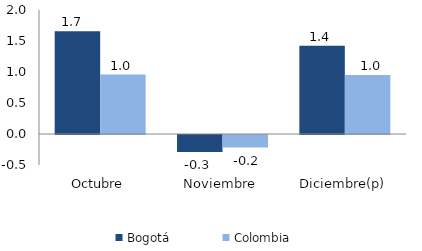
| Category | Bogotá | Colombia |
|---|---|---|
| Octubre | 1.657 | 0.959 |
| Noviembre | -0.273 | -0.204 |
| Diciembre(p) | 1.424 | 0.953 |